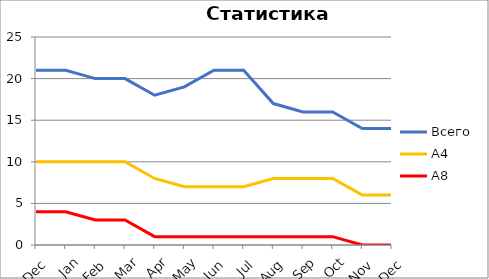
| Category | Всего | А4 | A8 |
|---|---|---|---|
| 0 | 21 | 10 | 4 |
| 1 | 21 | 10 | 4 |
| 2 | 20 | 10 | 3 |
| 3 | 20 | 10 | 3 |
| 4 | 18 | 8 | 1 |
| 5 | 19 | 7 | 1 |
| 6 | 21 | 7 | 1 |
| 7 | 21 | 7 | 1 |
| 8 | 17 | 8 | 1 |
| 9 | 16 | 8 | 1 |
| 10 | 16 | 8 | 1 |
| 11 | 14 | 6 | 0 |
| 12 | 14 | 6 | 0 |